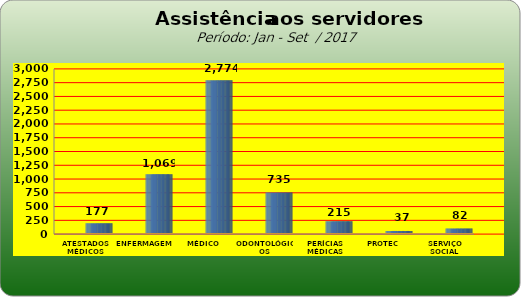
| Category | Series 0 |
|---|---|
| ATESTADOS MÉDICOS | 177 |
| ENFERMAGEM | 1069 |
| MÉDICO | 2774 |
| ODONTOLÓGICOS | 735 |
| PERÍCIAS MÉDICAS | 215 |
| PROTEC | 37 |
| SERVIÇO SOCIAL | 82 |